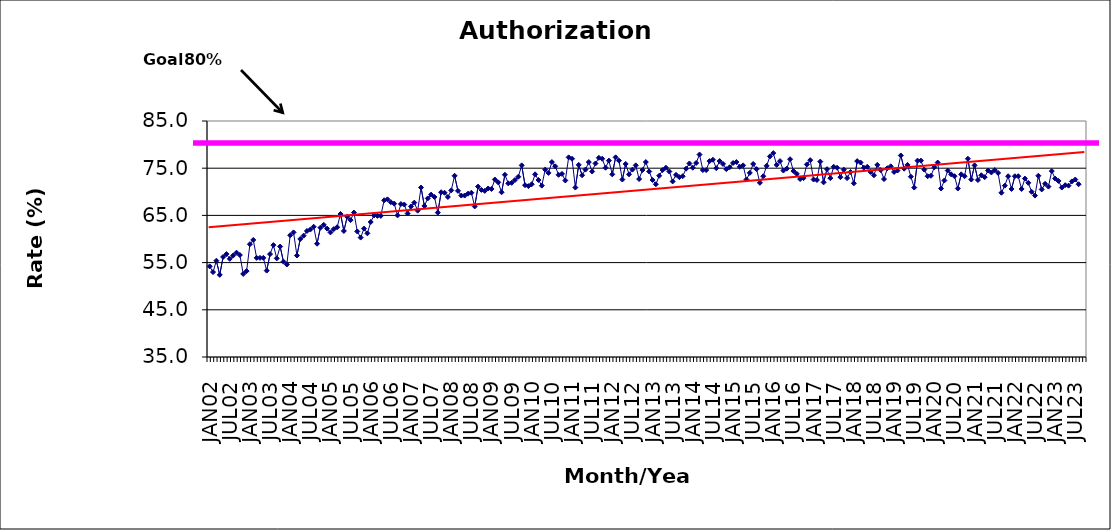
| Category | Series 0 |
|---|---|
| JAN02 | 54.2 |
| FEB02 | 53 |
| MAR02 | 55.4 |
| APR02 | 52.4 |
| MAY02 | 56.2 |
| JUN02 | 56.8 |
| JUL02 | 55.8 |
| AUG02 | 56.5 |
| SEP02 | 57.1 |
| OCT02 | 56.6 |
| NOV02 | 52.6 |
| DEC02 | 53.2 |
| JAN03 | 58.9 |
| FEB03 | 59.8 |
| MAR03 | 56 |
| APR03 | 56 |
| MAY03 | 56 |
| JUN03 | 53.3 |
| JUL03 | 56.8 |
| AUG03 | 58.7 |
| SEP03 | 55.9 |
| OCT03 | 58.4 |
| NOV03 | 55.2 |
| DEC03 | 54.6 |
| JAN04 | 60.8 |
| FEB04 | 61.4 |
| MAR04 | 56.5 |
| APR04 | 60 |
| MAY04 | 60.7 |
| JUN04 | 61.7 |
| JUL04 | 62 |
| AUG04 | 62.6 |
| SEP04 | 59 |
| OCT04 | 62.4 |
| NOV04 | 63 |
| DEC04 | 62.2 |
| JAN05 | 61.4 |
| FEB05 | 62.1 |
| MAR05 | 62.5 |
| APR05 | 65.3 |
| MAY05 | 61.7 |
| JUN05 | 64.7 |
| JUL05 | 64 |
| AUG05 | 65.6 |
| SEP05 | 61.6 |
| OCT05 | 60.3 |
| NOV05 | 62.2 |
| DEC05 | 61.2 |
| JAN06 | 63.6 |
| FEB06 | 65 |
| MAR06 | 64.9 |
| APR06 | 64.9 |
| MAY06 | 68.2 |
| JUN06 | 68.4 |
| JUL06 | 67.8 |
| AUG06 | 67.5 |
| SEP06 | 65 |
| OCT06 | 67.4 |
| NOV06 | 67.3 |
| DEC06 | 65.4 |
| JAN07 | 66.9 |
| FEB07 | 67.7 |
| MAR07 | 66 |
| APR07 | 70.9 |
| MAY07 | 67 |
| JUN07 | 68.6 |
| JUL07 | 69.4 |
| AUG07 | 68.9 |
| SEP07 | 65.6 |
| OCT07 | 69.9 |
| NOV07 | 69.8 |
| DEC07 | 68.9 |
| JAN08 | 70.3 |
| FEB08 | 73.4 |
| MAR08 | 70.2 |
| APR08 | 69.2 |
| MAY08 | 69.2 |
| JUN08 | 69.6 |
| JUL08 | 69.8 |
| AUG08 | 66.9 |
| SEP08 | 71.1 |
| OCT08 | 70.4 |
| NOV08 | 70.2 |
| DEC08 | 70.7 |
| JAN09 | 70.6 |
| FEB09 | 72.6 |
| MAR09 | 72 |
| APR09 | 69.9 |
| MAY09 | 73.6 |
| JUN09 | 71.8 |
| JUL09 | 71.9 |
| AUG09 | 72.5 |
| SEP09 | 73.2 |
| OCT09 | 75.6 |
| NOV09 | 71.4 |
| DEC09 | 71.2 |
| JAN10 | 71.6 |
| FEB10 | 73.7 |
| MAR10 | 72.5 |
| APR10 | 71.3 |
| MAY10 | 74.7 |
| JUN10 | 74 |
| JUL10 | 76.3 |
| AUG10 | 75.4 |
| SEP10 | 73.6 |
| OCT10 | 73.8 |
| NOV10 | 72.4 |
| DEC10 | 77.3 |
| JAN11 | 77 |
| FEB11 | 70.9 |
| MAR11 | 75.7 |
| APR11 | 73.5 |
| MAY11 | 74.7 |
| JUN11 | 76.3 |
| JUL11 | 74.3 |
| AUG11 | 76 |
| SEP11 | 77.2 |
| OCT11 | 77 |
| NOV11 | 75.1 |
| DEC11 | 76.6 |
| JAN12 | 73.7 |
| FEB12 | 77.3 |
| MAR12 | 76.6 |
| APR12 | 72.6 |
| MAY12 | 75.9 |
| JUN12 | 73.7 |
| JUL12 | 74.7 |
| AUG12 | 75.6 |
| SEP12 | 72.7 |
| OCT12 | 74.6 |
| NOV12 | 76.3 |
| DEC12 | 74.3 |
| JAN13 | 72.5 |
| FEB13 | 71.6 |
| MAR13 | 73.4 |
| APR13 | 74.6 |
| MAY13 | 75.1 |
| JUN13 | 74.3 |
| JUL13 | 72.2 |
| AUG13 | 73.6 |
| SEP13 | 73.1 |
| OCT13 | 73.3 |
| NOV13 | 74.9 |
| DEC13 | 76 |
| JAN14 | 75.1 |
| FEB14 | 76.1 |
| MAR14 | 77.9 |
| APR14 | 74.6 |
| MAY14 | 74.6 |
| JUN14 | 76.5 |
| JUL14 | 76.8 |
| AUG14 | 75 |
| SEP14 | 76.5 |
| OCT14 | 75.9 |
| NOV14 | 74.8 |
| DEC14 | 75.2 |
| JAN15 | 76.1 |
| FEB15 | 76.3 |
| MAR15 | 75.3 |
| APR15 | 75.6 |
| MAY15 | 72.6 |
| JUN15 | 74 |
| JUL15 | 75.9 |
| AUG15 | 74.8 |
| SEP15 | 71.9 |
| OCT15 | 73.3 |
| NOV15 | 75.5 |
| DEC15 | 77.5 |
| JAN16 | 78.2 |
| FEB16 | 75.7 |
| MAR16 | 76.5 |
| APR16 | 74.5 |
| MAY16 | 74.9 |
| JUN16 | 76.9 |
| JUL16 | 74.4 |
| AUG16 | 73.8 |
| SEP16 | 72.7 |
| OCT16 | 72.9 |
| NOV16 | 75.8 |
| DEC16 | 76.7 |
| JAN17 | 72.6 |
| FEB17 | 72.5 |
| MAR17 | 76.4 |
| APR17 | 72 |
| MAY17 | 74.8 |
| JUN17 | 72.9 |
| JUL17 | 75.3 |
| AUG17 | 75.1 |
| SEP17 | 73.1 |
| OCT17 | 74.7 |
| NOV17 | 72.9 |
| DEC17 | 74.2 |
| JAN18 | 71.8 |
| FEB18 | 76.5 |
| MAR18 | 76.2 |
| APR18 | 75.1 |
| MAY18 | 75.3 |
| JUN18 | 74.2 |
| JUL18 | 73.5 |
| AUG18 | 75.7 |
| SEP18 | 74.6 |
| OCT18 | 72.7 |
| NOV18 | 75 |
| DEC18 | 75.4 |
| JAN19 | 74.2 |
| FEB19 | 74.5 |
| MAR19 | 77.7 |
| APR19 | 74.9 |
| MAY19 | 75.7 |
| JUN19 | 73.2 |
| JUL19 | 70.9 |
| AUG19 | 76.6 |
| SEP19 | 76.6 |
| OCT19 | 74.7 |
| NOV19 | 73.3 |
| DEC19 | 73.4 |
| JAN20 | 75.2 |
| FEB20 | 76.2 |
| MAR20 | 70.7 |
| APR20 | 72.4 |
| MAY20 | 74.5 |
| JUN20 | 73.7 |
| JUL20 | 73.3 |
| AUG20 | 70.7 |
| SEP20 | 73.7 |
| OCT20 | 73.3 |
| NOV20 | 77 |
| DEC20 | 72.6 |
| JAN21 | 75.6 |
| FEB21 | 72.5 |
| MAR21 | 73.5 |
| APR21 | 73.1 |
| MAY21 | 74.5 |
| JUN21 | 74.1 |
| JUL21 | 74.6 |
| AUG21 | 74 |
| SEP21 | 69.8 |
| OCT21 | 71.3 |
| NOV21 | 73.3 |
| DEC21 | 70.6 |
| JAN22 | 73.3 |
| FEB22 | 73.3 |
| MAR22 | 70.6 |
| APR22 | 72.8 |
| MAY22 | 71.9 |
| JUN22 | 70 |
| JUL22 | 69.2 |
| AUG22 | 73.4 |
| SEP22 | 70.5 |
| OCT22 | 71.7 |
| NOV22 | 71.1 |
| DEC22 | 74.4 |
| JAN23 | 72.8 |
| FEB23 | 72.3 |
| MAR23 | 70.9 |
| APR23 | 71.4 |
| MAY23 | 71.3 |
| JUN23 | 72.2 |
| JUL23 | 72.6 |
| AUG23 | 71.6 |